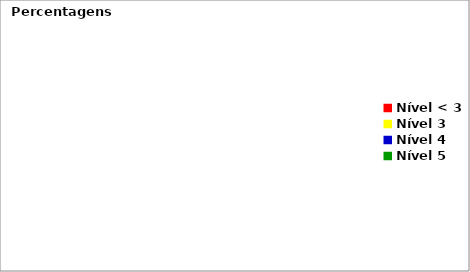
| Category | Series 0 |
|---|---|
| Nível < 3 | 0 |
| Nível 3 | 0 |
| Nível 4 | 0 |
| Nível 5 | 0 |